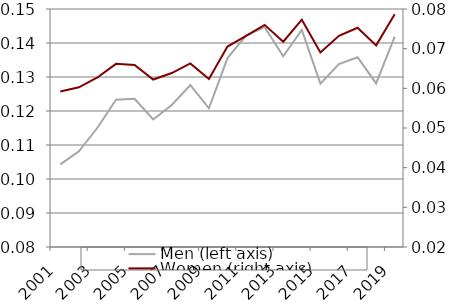
| Category | Men (left axis) |
|---|---|
| 2001.0 | 0.104 |
| 2002.0 | 0.108 |
| 2003.0 | 0.115 |
| 2004.0 | 0.123 |
| 2005.0 | 0.124 |
| 2006.0 | 0.118 |
| 2007.0 | 0.122 |
| 2008.0 | 0.128 |
| 2009.0 | 0.121 |
| 2010.0 | 0.136 |
| 2011.0 | 0.142 |
| 2012.0 | 0.145 |
| 2013.0 | 0.136 |
| 2014.0 | 0.144 |
| 2015.0 | 0.128 |
| 2016.0 | 0.134 |
| 2017.0 | 0.136 |
| 2018.0 | 0.128 |
| 2019.0 | 0.142 |